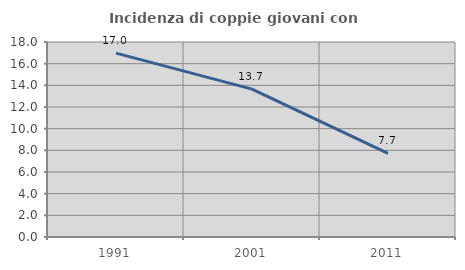
| Category | Incidenza di coppie giovani con figli |
|---|---|
| 1991.0 | 16.969 |
| 2001.0 | 13.65 |
| 2011.0 | 7.718 |